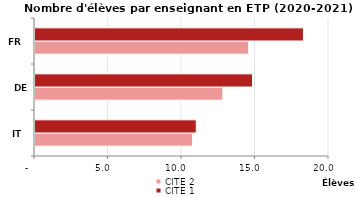
| Category | CITE 2 | CITE 1 |
|---|---|---|
| IT | 10.72 | 10.97 |
| DE | 12.775 | 14.8 |
| FR | 14.54 | 18.26 |